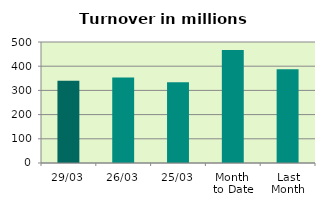
| Category | Series 0 |
|---|---|
| 29/03 | 340.057 |
| 26/03 | 352.985 |
| 25/03 | 333.801 |
| Month 
to Date | 467.405 |
| Last
Month | 387.65 |